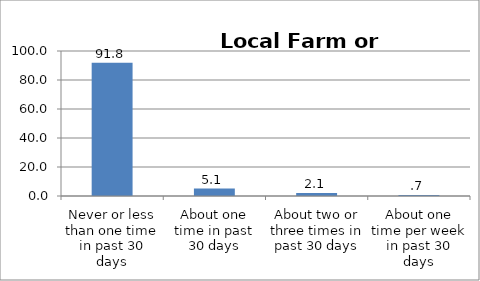
| Category | Series 0 |
|---|---|
| Never or less than one time in past 30 days | 91.848 |
| About one time in past 30 days | 5.108 |
| About two or three times in past 30 days | 2.134 |
| About one time per week in past 30 days | 0.693 |